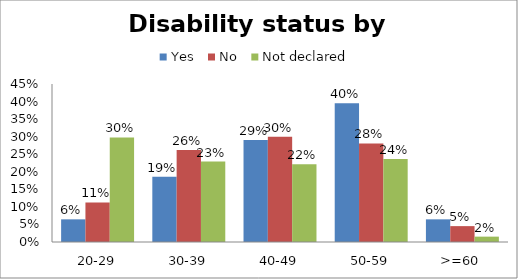
| Category | Yes | No | Not declared |
|---|---|---|---|
| 20-29 | 0.065 | 0.113 | 0.298 |
| 30-39 | 0.185 | 0.262 | 0.229 |
| 40-49 | 0.29 | 0.299 | 0.221 |
| 50-59 | 0.395 | 0.281 | 0.237 |
| >=60 | 0.065 | 0.045 | 0.015 |